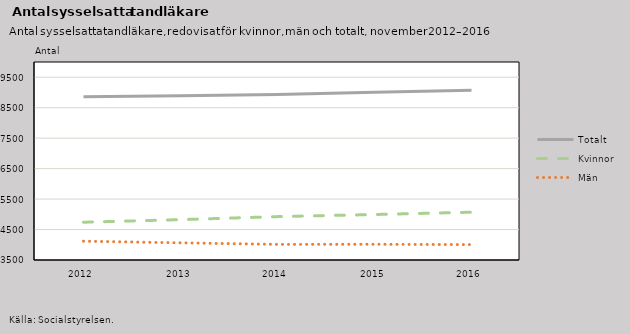
| Category | Totalt | Kvinnor | Män |
|---|---|---|---|
| 2012.0 | 8858 | 4740 | 4118 |
| 2013.0 | 8889 | 4825 | 4064 |
| 2014.0 | 8936 | 4924 | 4012 |
| 2015.0 | 9009 | 4993 | 4016 |
| 2016.0 | 9074 | 5069 | 4005 |